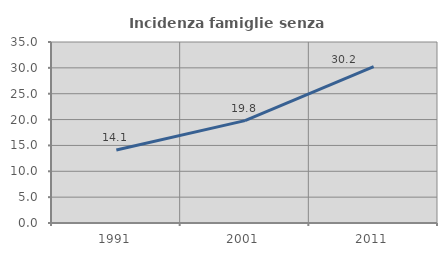
| Category | Incidenza famiglie senza nuclei |
|---|---|
| 1991.0 | 14.121 |
| 2001.0 | 19.799 |
| 2011.0 | 30.238 |